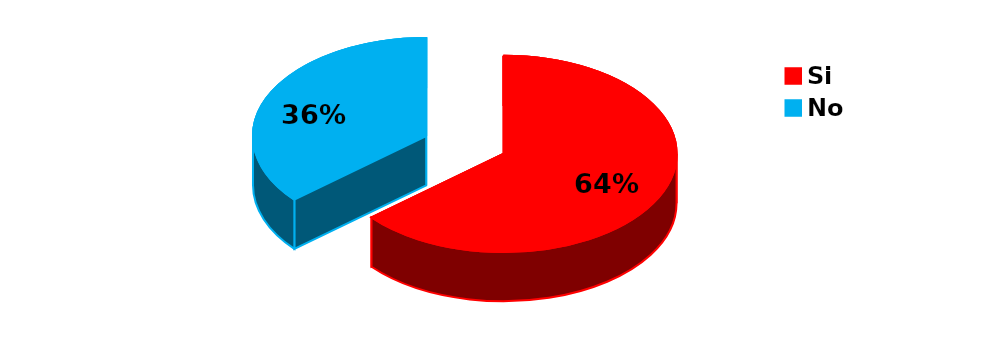
| Category | Series 0 |
|---|---|
| Si | 213 |
| No | 121 |